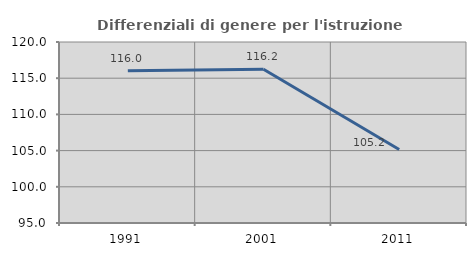
| Category | Differenziali di genere per l'istruzione superiore |
|---|---|
| 1991.0 | 116.041 |
| 2001.0 | 116.236 |
| 2011.0 | 105.154 |